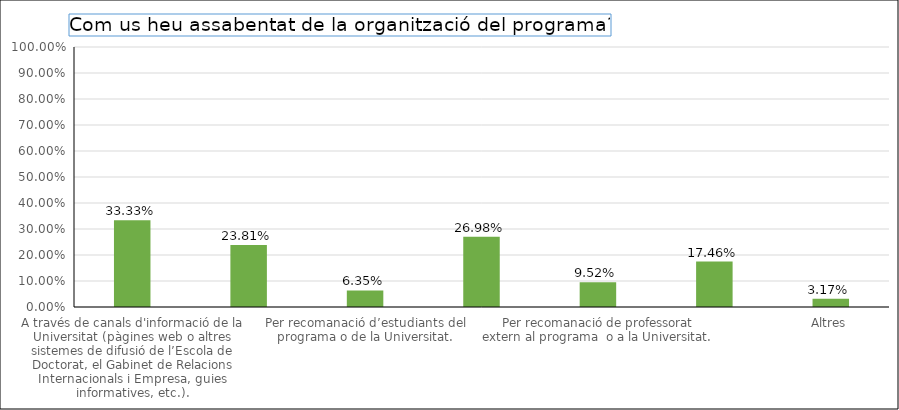
| Category | Series 0 |
|---|---|
| A través de canals d'informació de la Universitat (pàgines web o altres sistemes de difusió de l’Escola de Doctorat, el Gabinet de Relacions Internacionals i Empresa, guies informatives, etc.). | 0.333 |
| A través del departament o de l'institut (pàgines web pròpies i altres sistemes de difusió). | 0.238 |
| Per recomanació d’estudiants del programa o de la Universitat. | 0.063 |
| Per recomanació de professorat del programa o de la Universitat. | 0.27 |
| Per recomanació de professorat extern al programa  o a la Universitat. | 0.095 |
| Webs especialitzats. | 0.175 |
| Altres | 0.032 |